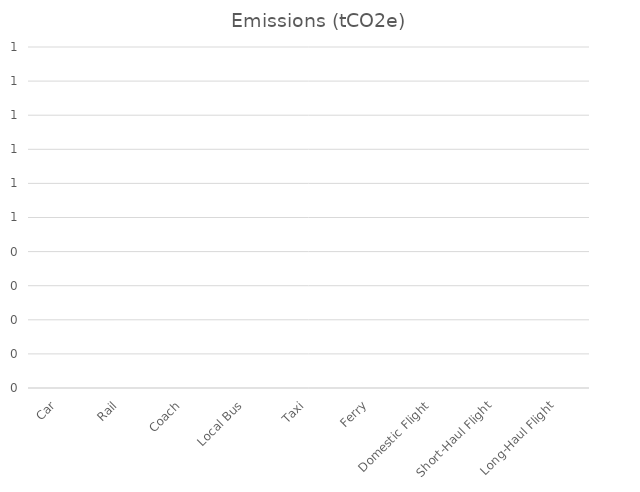
| Category | Emissions (tCO2e) |
|---|---|
| Car | 0 |
| Rail | 0 |
| Coach | 0 |
| Local Bus | 0 |
| Taxi | 0 |
| Ferry | 0 |
| Domestic Flight | 0 |
| Short-Haul Flight | 0 |
| Long-Haul Flight | 0 |